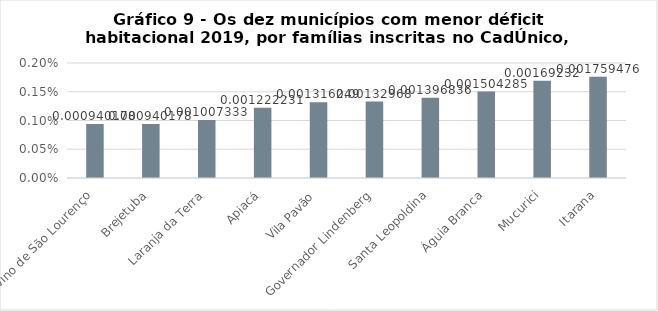
| Category | Series 0 |
|---|---|
| Divino de São Lourenço | 0.001 |
| Brejetuba | 0.001 |
| Laranja da Terra | 0.001 |
| Apiacá | 0.001 |
| Vila Pavão | 0.001 |
| Governador Lindenberg | 0.001 |
| Santa Leopoldina | 0.001 |
| Águia Branca | 0.002 |
| Mucurici | 0.002 |
| Itarana | 0.002 |